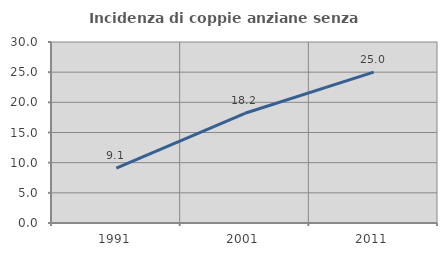
| Category | Incidenza di coppie anziane senza figli  |
|---|---|
| 1991.0 | 9.091 |
| 2001.0 | 18.182 |
| 2011.0 | 25 |